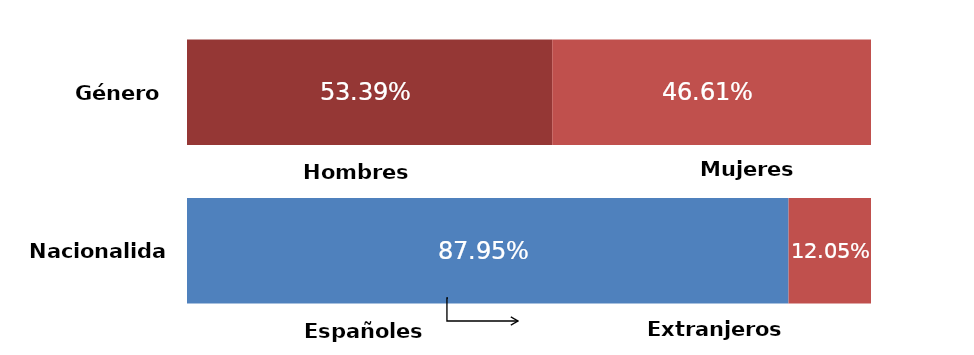
| Category | Series 0 | Series 1 |
|---|---|---|
| 0 | 0.534 | 0.466 |
| 1 | 0.879 | 0.121 |